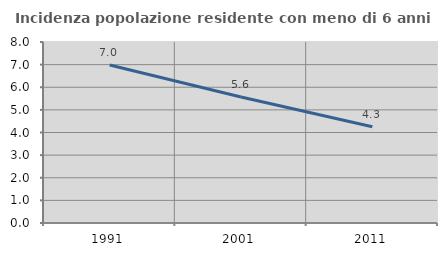
| Category | Incidenza popolazione residente con meno di 6 anni |
|---|---|
| 1991.0 | 6.98 |
| 2001.0 | 5.572 |
| 2011.0 | 4.252 |